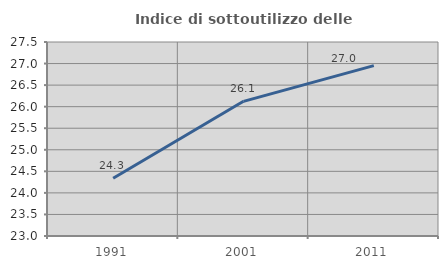
| Category | Indice di sottoutilizzo delle abitazioni  |
|---|---|
| 1991.0 | 24.339 |
| 2001.0 | 26.124 |
| 2011.0 | 26.952 |